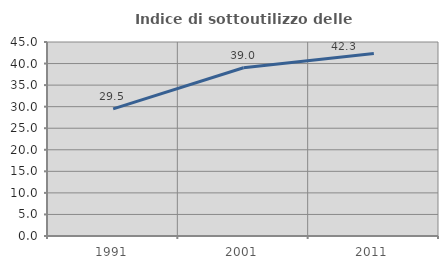
| Category | Indice di sottoutilizzo delle abitazioni  |
|---|---|
| 1991.0 | 29.484 |
| 2001.0 | 39.024 |
| 2011.0 | 42.32 |